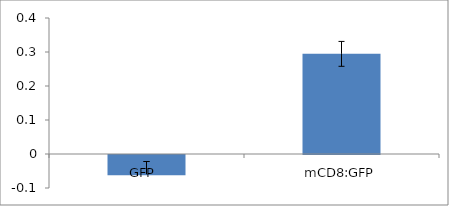
| Category | Series 0 |
|---|---|
| GFP  | -0.059 |
| mCD8:GFP | 0.295 |